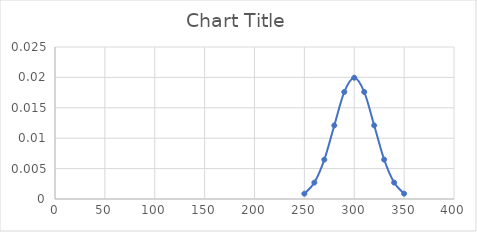
| Category | Series 0 |
|---|---|
| 250.0 | 0.001 |
| 260.0 | 0.003 |
| 270.0 | 0.006 |
| 280.0 | 0.012 |
| 290.0 | 0.018 |
| 300.0 | 0.02 |
| 310.0 | 0.018 |
| 320.0 | 0.012 |
| 330.0 | 0.006 |
| 340.0 | 0.003 |
| 350.0 | 0.001 |